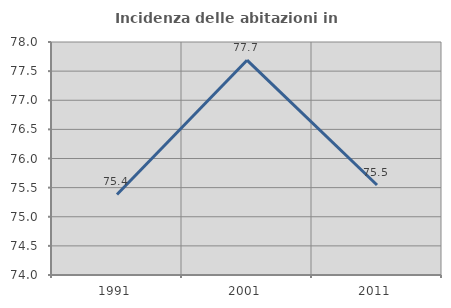
| Category | Incidenza delle abitazioni in proprietà  |
|---|---|
| 1991.0 | 75.383 |
| 2001.0 | 77.688 |
| 2011.0 | 75.544 |